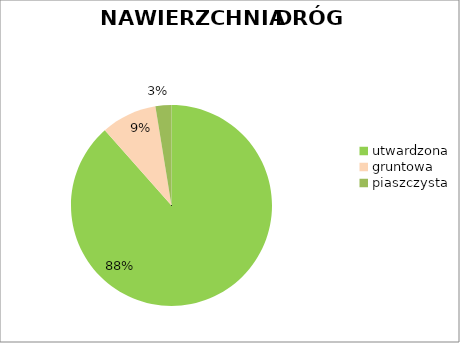
| Category | Series 0 |
|---|---|
| utwardzona | 0.885 |
| gruntowa | 0.09 |
| piaszczysta | 0.026 |